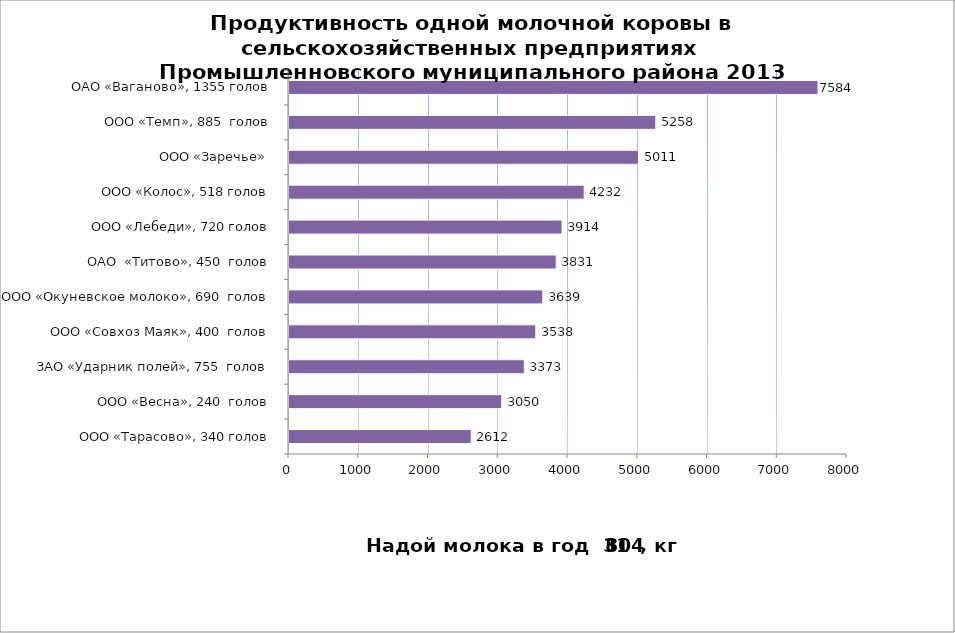
| Category | Series 0 |
|---|---|
| ООО «Тарасово», 340 голов | 2612 |
| ООО «Весна», 240  голов | 3050 |
| ЗАО «Ударник полей», 755  голов | 3373 |
| ООО «Совхоз Маяк», 400  голов | 3538 |
| ООО «Окуневское молоко», 690  голов | 3639 |
| ОАО  «Титово», 450  голов | 3831 |
| ООО «Лебеди», 720 голов | 3914 |
| ООО «Колос», 518 голов | 4232 |
| ООО «Заречье»  | 5011 |
| ООО «Темп», 885  голов | 5258 |
| ОАО «Ваганово», 1355 голов | 7584 |